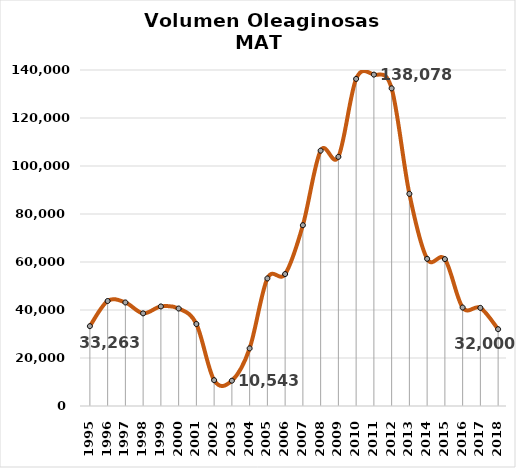
| Category | OLEGINOSAS |
|---|---|
| 1995.0 | 33263 |
| 1996.0 | 43750 |
| 1997.0 | 43142 |
| 1998.0 | 38597 |
| 1999.0 | 41486 |
| 2000.0 | 40623 |
| 2001.0 | 34165 |
| 2002.0 | 10757 |
| 2003.0 | 10543 |
| 2004.0 | 24015 |
| 2005.0 | 53148 |
| 2006.0 | 54975 |
| 2007.0 | 75333 |
| 2008.0 | 106395 |
| 2009.0 | 103808 |
| 2010.0 | 136295 |
| 2011.0 | 138078 |
| 2012.0 | 132352 |
| 2013.0 | 88405 |
| 2014.0 | 61328 |
| 2015.0 | 61208 |
| 2016.0 | 41032 |
| 2017.0 | 40890 |
| 2018.0 | 32000 |